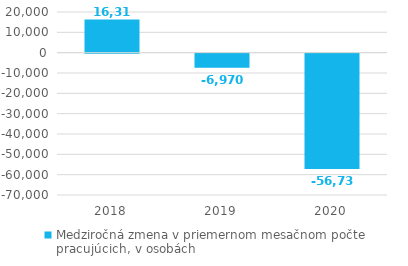
| Category | Medziročná zmena v priemernom mesačnom počte pracujúcich, v osobách |
|---|---|
| 2018.0 | 16311.083 |
| 2019.0 | -6970.083 |
| 2020.0 | -56730.083 |